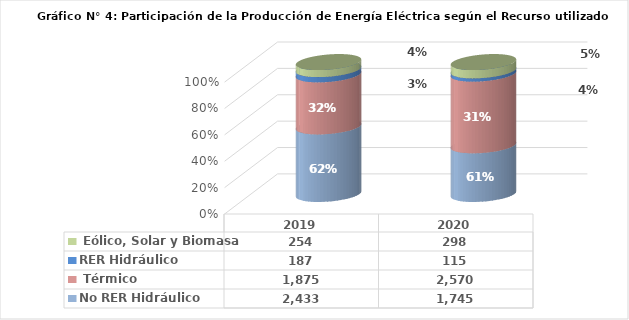
| Category | No RER | RER |
|---|---|---|
| 2019.0 | 1875.328 | 254.424 |
| 2020.0 | 2569.611 | 298.421 |